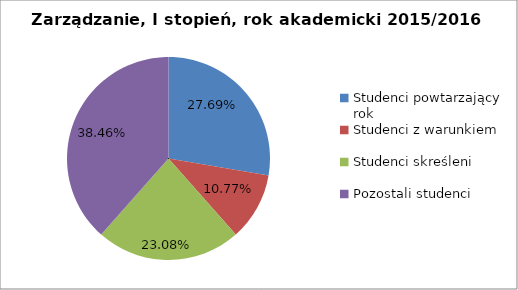
| Category | Series 0 |
|---|---|
| Studenci powtarzający rok | 18 |
| Studenci z warunkiem | 7 |
| Studenci skreśleni | 15 |
| Pozostali studenci | 25 |